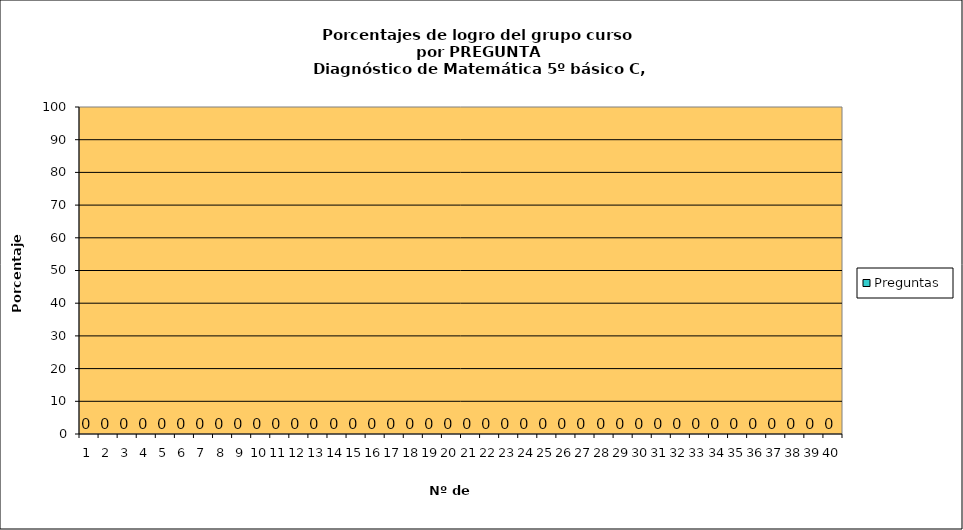
| Category | Preguntas |
|---|---|
| 0 | 0 |
| 1 | 0 |
| 2 | 0 |
| 3 | 0 |
| 4 | 0 |
| 5 | 0 |
| 6 | 0 |
| 7 | 0 |
| 8 | 0 |
| 9 | 0 |
| 10 | 0 |
| 11 | 0 |
| 12 | 0 |
| 13 | 0 |
| 14 | 0 |
| 15 | 0 |
| 16 | 0 |
| 17 | 0 |
| 18 | 0 |
| 19 | 0 |
| 20 | 0 |
| 21 | 0 |
| 22 | 0 |
| 23 | 0 |
| 24 | 0 |
| 25 | 0 |
| 26 | 0 |
| 27 | 0 |
| 28 | 0 |
| 29 | 0 |
| 30 | 0 |
| 31 | 0 |
| 32 | 0 |
| 33 | 0 |
| 34 | 0 |
| 35 | 0 |
| 36 | 0 |
| 37 | 0 |
| 38 | 0 |
| 39 | 0 |